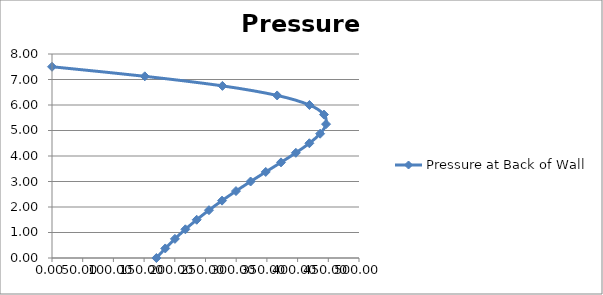
| Category | Pressure at Back of Wall |
|---|---|
| 0.0 | 7.5 |
| 151.12994514295968 | 7.125 |
| 277.5542478964015 | 6.75 |
| 366.70036121521736 | 6.375 |
| 419.28309307761845 | 6 |
| 442.93305575618996 | 5.625 |
| 446.35777551966845 | 5.25 |
| 436.71734914148885 | 4.875 |
| 419.1575375729387 | 4.5 |
| 397.1527432612559 | 4.125 |
| 372.9798129512631 | 3.75 |
| 348.10611764581154 | 3.375 |
| 323.463108831177 | 3 |
| 299.6287084820422 | 2.625 |
| 276.94688823932273 | 2.25 |
| 255.60619333315827 | 1.875 |
| 235.69182778249845 | 1.5 |
| 217.2206493929145 | 1.125 |
| 200.16497003706738 | 0.75 |
| 184.4688942528587 | 0.375 |
| 170.05959383488806 | 0 |